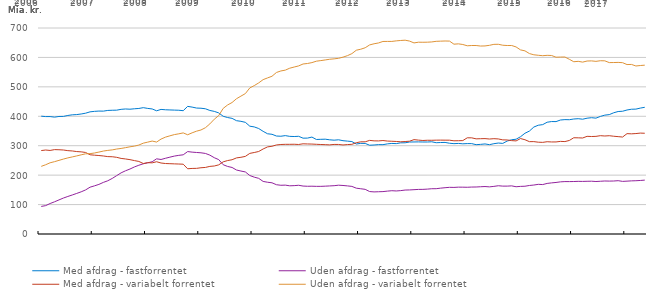
| Category | Med afdrag - fastforrentet | Uden afdrag - fastforrentet | Med afdrag - variabelt forrentet | Uden afdrag - variabelt forrentet |
|---|---|---|---|---|
| 2006 | 400352689000 | 93663533000 | 283505750000 | 229830563000 |
|  | 399000477000 | 96467463000 | 285347599000 | 235327252000 |
|  | 399012250000 | 103540784000 | 283935460000 | 242006709000 |
|  | 397131977000 | 109420685000 | 286758061000 | 245784394000 |
|  | 399376751000 | 115802696000 | 286297097000 | 250205313000 |
|  | 399604125000 | 122175388000 | 285435954000 | 254614249000 |
|  | 402822951000 | 127575992000 | 283257813000 | 258613005000 |
|  | 404984894000 | 132593778000 | 282149486000 | 261922942000 |
|  | 405798170000 | 137910882000 | 280095104000 | 265350977000 |
|  | 407769877000 | 143355355000 | 279149522000 | 268994497000 |
|  | 410481424000 | 149814613000 | 277014155000 | 272478858000 |
|  | 415083407000 | 159088659000 | 269233023000 | 273085862000 |
| 2007 | 416774089000 | 163635711000 | 267845155000 | 275251437000 |
|  | 417716288000 | 168531585000 | 266685414000 | 278413910000 |
|  | 417515644000 | 175354450000 | 265128604000 | 281788029000 |
|  | 419905179000 | 180842127000 | 262929635000 | 284075940000 |
|  | 420463267000 | 188818325000 | 262515734000 | 285765999000 |
|  | 420777435000 | 198311810000 | 260551104000 | 288682213000 |
|  | 423621991000 | 207795445000 | 256854592000 | 290719354000 |
|  | 424813678000 | 214823986000 | 254977127000 | 293443575000 |
|  | 424025713000 | 220779965000 | 252669569000 | 296310989000 |
|  | 425517088000 | 227864929000 | 249491534000 | 298627203000 |
|  | 426577323000 | 233629616000 | 246565234000 | 302228602000 |
|  | 429288256000 | 238586428000 | 239557034000 | 308675323000 |
| 2008 | 426741287000 | 241911734000 | 242478639000 | 312194144000 |
|  | 424946570000 | 245519353000 | 241746133000 | 315849612000 |
|  | 418626034000 | 255472965000 | 245512735000 | 312394296000 |
|  | 423328399000 | 253168077000 | 241245760000 | 322552619000 |
|  | 422138172000 | 257326064000 | 239490735000 | 329171668000 |
|  | 421519764000 | 261170315000 | 238914077000 | 333631460000 |
|  | 421027793000 | 264749236000 | 238338346000 | 337781171000 |
|  | 420532764000 | 267239306000 | 237796622000 | 340421648000 |
|  | 419021117000 | 269126719000 | 237150274000 | 343571801000 |
|  | 433679567000 | 280079353000 | 221632865000 | 337176383000 |
|  | 431229074000 | 278171255000 | 222793210000 | 343814311000 |
|  | 427946158000 | 277044892000 | 223103458000 | 349382977000 |
| 2009 | 427395433000 | 275903731000 | 225082037000 | 353502195000 |
|  | 425448224000 | 273720279000 | 226188727000 | 361202504000 |
|  | 419811214000 | 268001465000 | 229746357000 | 374146702000 |
|  | 416608097000 | 259238185000 | 231118841000 | 390160984000 |
|  | 411491459000 | 252727693000 | 234977313000 | 402426854000 |
|  | 400042392000 | 235454245000 | 245211201000 | 426807927000 |
|  | 395727477000 | 229533224000 | 249552981000 | 438497007000 |
|  | 392992292000 | 226100388000 | 252317549000 | 446743104000 |
|  | 385069800000 | 217455765000 | 258601590000 | 459658127000 |
|  | 382911766000 | 213919486000 | 260665611000 | 468496522000 |
|  | 379446938000 | 210841847000 | 263772071000 | 477111361000 |
|  | 366373118000 | 198701061000 | 273943663000 | 496398663000 |
| 2010 | 363878477000 | 193205379000 | 276903630000 | 504292345000 |
|  | 358473723000 | 189130174000 | 280338606000 | 513375766000 |
|  | 348878822000 | 178705386000 | 288844074000 | 524559494000 |
|  | 340600363000 | 175863975000 | 295991134000 | 530381734000 |
|  | 338837751000 | 173997366000 | 298146123000 | 536031580000 |
|  | 332948060000 | 167503303000 | 302581479000 | 548868724000 |
|  | 332179008000 | 165599392000 | 304131533000 | 554036949000 |
|  | 334305990000 | 166067341000 | 304661827000 | 556838739000 |
|  | 331747577000 | 163779336000 | 304741006000 | 563421266000 |
|  | 331244855000 | 164366336000 | 304946706000 | 567399419000 |
|  | 331998165000 | 165573179000 | 304142430000 | 571160689000 |
|  | 325678829000 | 162933896000 | 306471607000 | 577674339000 |
| 2011 | 325843558000 | 162199412000 | 305933640000 | 579387033000 |
|  | 329367718000 | 162404138000 | 305600907000 | 582415600000 |
|  | 321185924000 | 161887801000 | 304768125000 | 587209145000 |
|  | 321747638000 | 161937529000 | 304087152000 | 589296572000 |
|  | 322227487000 | 162565051000 | 303575602000 | 591469636000 |
|  | 320099491000 | 163319620000 | 302856101000 | 593780331000 |
|  | 318783843000 | 164137823000 | 304373914000 | 595152921000 |
|  | 320160595000 | 165858359000 | 304242420000 | 597008536000 |
|  | 317077652000 | 164871834000 | 302551248000 | 600885090000 |
|  | 315627547000 | 163440021000 | 303880427000 | 606055239000 |
|  | 314107024000 | 161738099000 | 304665502000 | 612902066000 |
|  | 305785395000 | 155699088000 | 310245631000 | 624462355000 |
| 2012 | 307971932000 | 153709163000 | 313228973000 | 627907782000 |
|  | 307727014000 | 151782217000 | 313271586000 | 632843520000 |
|  | 301647448000 | 144247328000 | 318114736000 | 642520543000 |
|  | 302455489000 | 143079319000 | 316514635000 | 646403623000 |
|  | 303740666000 | 143619323000 | 316295293000 | 649154447000 |
|  | 303540650000 | 144082337000 | 317626409000 | 654259831000 |
|  | 306210127000 | 145700423000 | 315833814000 | 654443832000 |
|  | 307762178000 | 147086415000 | 315126400000 | 654428017000 |
|  | 307105912000 | 146230020000 | 314452225000 | 656290547000 |
|  | 309789253000 | 147425040000 | 313394297000 | 657602766000 |
|  | 309923958000 | 149338989000 | 314187660000 | 658543623000 |
|  | 312515718000 | 149766530000 | 315341061000 | 655514927000 |
| 2013 | 312774117000 | 150600494000 | 320643614000 | 649330799000 |
|  | 312954168000 | 151522621000 | 319034167000 | 651702093000 |
|  | 312615774000 | 151663115000 | 317740424000 | 651530797000 |
|  | 312584737000 | 152500524000 | 318535788000 | 651746532000 |
|  | 313341831000 | 153831240000 | 318415259000 | 652604621000 |
|  | 310154469000 | 153945616000 | 318859893000 | 654715274000 |
|  | 310868695000 | 155825835000 | 319013481000 | 655298110000 |
|  | 311219504000 | 157267161000 | 318851321000 | 655866174000 |
|  | 308430286000 | 158614609000 | 318781188000 | 655488950000 |
|  | 306943366335.87 | 158291739192.88 | 316684396127.39 | 644994475265.47 |
|  | 307760986631.89 | 159221372213.91 | 316938093537.85 | 646145573088.24 |
|  | 306468221534.09 | 159103942639.91 | 317430335753.02 | 643973453227.11 |
| 2014 | 307190600263.52 | 158793198604.91 | 326881376986.17 | 639542260906.29 |
|  | 307146593008.26 | 159501203766.91 | 326755521296.75 | 640486928209.11 |
|  | 303535843974.93 | 159750350837.91 | 323334426290.57 | 640478701640.09 |
|  | 304576379639.61 | 160604552989.91 | 323797725488.93 | 638712151266.81 |
|  | 305993804252 | 161260202937 | 324164465779 | 639063049241 |
|  | 303592898142 | 160175072176 | 322728486249 | 641145735171 |
|  | 306866947488 | 161814589013 | 323895226840 | 644440782307 |
|  | 309082846669.9 | 163957935231.91 | 323005991494.92 | 644638040055.31 |
|  | 307848089987.54 | 162697384185.56 | 319882986377.28 | 641450555060.25 |
|  | 315880448332.99 | 162689790946.56 | 319507047754.13 | 640427820608.88 |
|  | 320221309959.55 | 163554505201.56 | 317335268001.81 | 640571208999.35 |
|  | 322034865216.25 | 160603125307.56 | 316302297563.91 | 635641197430.57 |
| 2015 | 330533467803.28 | 161789440080.56 | 324395633829.49 | 625570451930.27 |
|  | 342351362530.98 | 162316489810.56 | 320270295994.23 | 622368344920.26 |
|  | 349762335585.11 | 164875247412.56 | 313799281421.53 | 613152826737.18 |
|  | 363476092987.17 | 166373218996.56 | 313947559798.53 | 608962420892.52 |
|  | 369569095649.24 | 168783779108.56 | 311951378123.98 | 607313122472.36 |
|  | 371705112749.44 | 167971462958.56 | 311384571034.98 | 605908188100.69 |
|  | 379826787166 | 171862873556 | 313573300552 | 607101461506 |
|  | 382095492278 | 173694156568 | 312750689727 | 606567091277 |
|  | 381935615429 | 175136871002 | 312792018685 | 600736738407 |
|  | 387356418542.04 | 177208740986.2 | 314710659176.6 | 601141042128.26 |
|  | 388654787294.17 | 178099021363.2 | 314081671504.01 | 601429001777.51 |
|  | 388336982742.76 | 178051631081.02 | 317846606220.53 | 593677298755.09 |
| 2016 | 390748915744.56 | 178317925375.02 | 327058322308.02 | 585385767122.92 |
|  | 391788235752.87 | 178910602527.02 | 326790110255.73 | 586688268132.75 |
|  | 390038446749.08 | 178664609747.02 | 326226870560.17 | 584048712649.48 |
|  | 393491220518.82 | 179120392338.02 | 331892358749.55 | 587760136395.76 |
|  | 395218165487.2 | 179361667378.02 | 331276140590.05 | 588195880994.61 |
|  | 393741444037 | 178392445496 | 331787214285 | 586695836558 |
|  | 399550259886 | 179243603537 | 334088661985 | 588786428046 |
|  | 403919151995 | 180110999727 | 333026220783 | 588423796585 |
|  | 405683485143.21 | 179778471516.47 | 333969019821.01 | 582426317977.37 |
|  | 411924058973.94 | 180074554871.47 | 332181986376.13 | 582648768164.79 |
|  | 416234037428.83 | 181209497180.47 | 330840598242.06 | 583107990884.08 |
|  | 417141095904.01 | 178821615854.65 | 329485572221.86 | 582148277998.27 |
| 2017 | 421377724197.57 | 179567985149.65 | 341047860686.35 | 575756064016.57 |